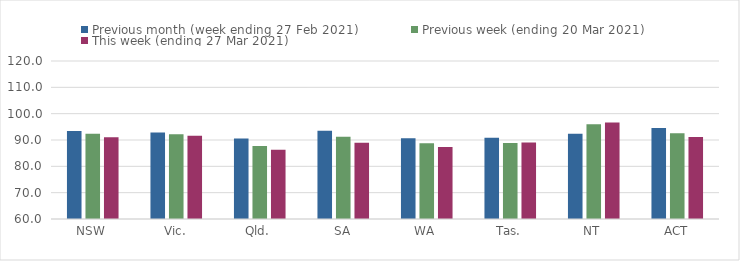
| Category | Previous month (week ending 27 Feb 2021) | Previous week (ending 20 Mar 2021) | This week (ending 27 Mar 2021) |
|---|---|---|---|
| NSW | 93.43 | 92.33 | 91.03 |
| Vic. | 92.88 | 92.23 | 91.66 |
| Qld. | 90.55 | 87.75 | 86.33 |
| SA | 93.54 | 91.19 | 88.97 |
| WA | 90.65 | 88.77 | 87.31 |
| Tas. | 90.9 | 88.85 | 89.02 |
| NT | 92.36 | 96.01 | 96.68 |
| ACT | 94.51 | 92.61 | 91.18 |